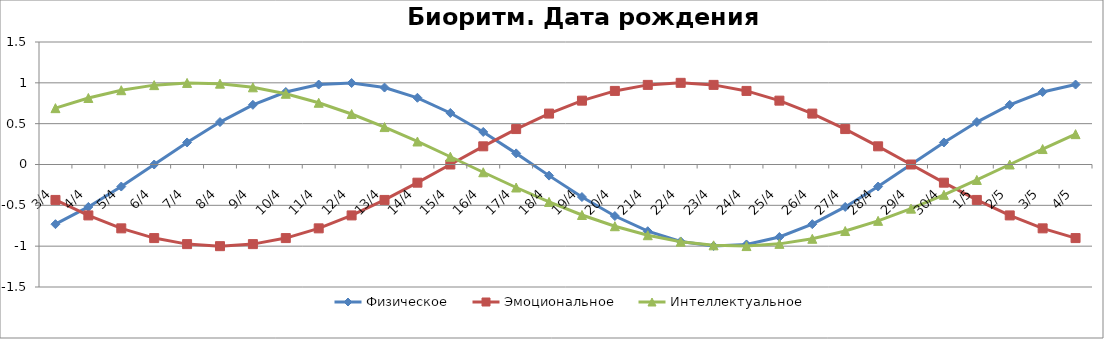
| Category | Физическое | Эмоциональное | Интеллектуальное |
|---|---|---|---|
| 2017-04-03 | -0.731 | -0.434 | 0.69 |
| 2017-04-04 | -0.52 | -0.623 | 0.815 |
| 2017-04-05 | -0.27 | -0.782 | 0.91 |
| 2017-04-06 | 0 | -0.901 | 0.972 |
| 2017-04-07 | 0.27 | -0.975 | 0.999 |
| 2017-04-08 | 0.52 | -1 | 0.99 |
| 2017-04-09 | 0.731 | -0.975 | 0.945 |
| 2017-04-10 | 0.888 | -0.901 | 0.866 |
| 2017-04-11 | 0.979 | -0.782 | 0.756 |
| 2017-04-12 | 0.998 | -0.623 | 0.618 |
| 2017-04-13 | 0.942 | -0.434 | 0.458 |
| 2017-04-14 | 0.817 | -0.223 | 0.282 |
| 2017-04-15 | 0.631 | 0 | 0.095 |
| 2017-04-16 | 0.398 | 0.223 | -0.095 |
| 2017-04-17 | 0.136 | 0.434 | -0.282 |
| 2017-04-18 | -0.136 | 0.623 | -0.458 |
| 2017-04-19 | -0.398 | 0.782 | -0.618 |
| 2017-04-20 | -0.631 | 0.901 | -0.756 |
| 2017-04-21 | -0.817 | 0.975 | -0.866 |
| 2017-04-22 | -0.942 | 1 | -0.945 |
| 2017-04-23 | -0.998 | 0.975 | -0.99 |
| 2017-04-24 | -0.979 | 0.901 | -0.999 |
| 2017-04-25 | -0.888 | 0.782 | -0.972 |
| 2017-04-26 | -0.731 | 0.623 | -0.91 |
| 2017-04-27 | -0.52 | 0.434 | -0.815 |
| 2017-04-28 | -0.27 | 0.223 | -0.69 |
| 2017-04-29 | 0 | 0 | -0.541 |
| 2017-04-30 | 0.27 | -0.223 | -0.372 |
| 2017-05-01 | 0.52 | -0.434 | -0.189 |
| 2017-05-02 | 0.731 | -0.623 | 0 |
| 2017-05-03 | 0.888 | -0.782 | 0.189 |
| 2017-05-04 | 0.979 | -0.901 | 0.372 |